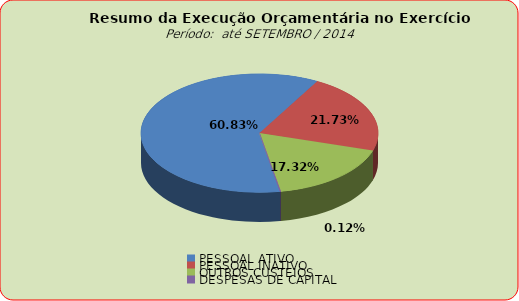
| Category | Series 0 |
|---|---|
| PESSOAL ATIVO | 89735200.7 |
| PESSOAL INATIVO | 32053391.15 |
| OUTROS CUSTEIOS | 25547895.61 |
| DESPESAS DE CAPITAL | 175213.95 |